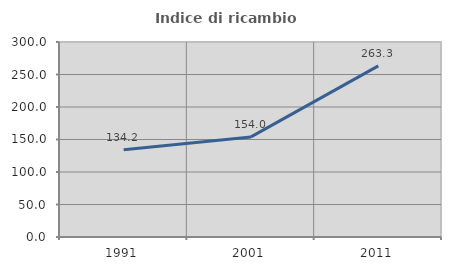
| Category | Indice di ricambio occupazionale  |
|---|---|
| 1991.0 | 134.228 |
| 2001.0 | 153.988 |
| 2011.0 | 263.281 |